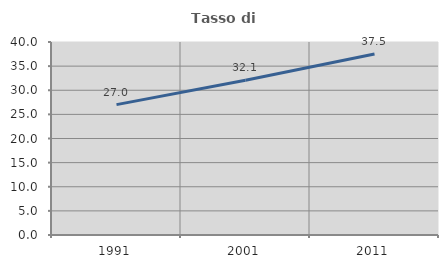
| Category | Tasso di occupazione   |
|---|---|
| 1991.0 | 27.024 |
| 2001.0 | 32.06 |
| 2011.0 | 37.518 |